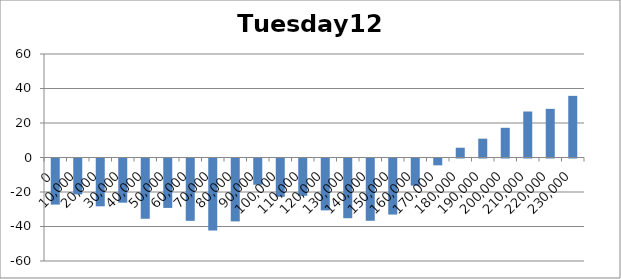
| Category | Tuesday120 |
|---|---|
| 0.0 | -26.72 |
| 10000.0 | -20.79 |
| 20000.0 | -27.715 |
| 30000.0 | -25.61 |
| 40000.0 | -34.93 |
| 50000.0 | -28.65 |
| 60000.0 | -36.13 |
| 70000.0 | -41.75 |
| 80000.0 | -36.475 |
| 90000.0 | -15.22 |
| 100000.0 | -22.195 |
| 110000.0 | -21.61 |
| 120000.0 | -30.07 |
| 130000.0 | -34.61 |
| 140000.0 | -36.095 |
| 150000.0 | -32.495 |
| 160000.0 | -15.745 |
| 170000.0 | -3.95 |
| 180000.0 | 5.67 |
| 190000.0 | 10.93 |
| 200000.0 | 17.21 |
| 210000.0 | 26.67 |
| 220000.0 | 28.2 |
| 230000.0 | 35.735 |